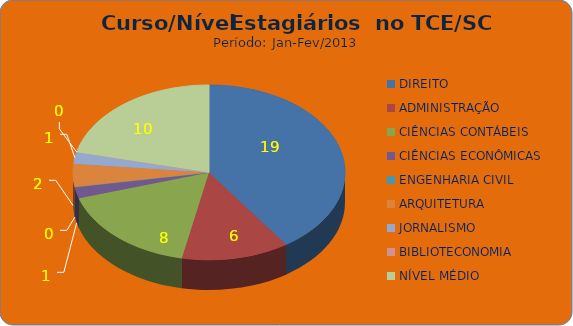
| Category | Series 0 |
|---|---|
| DIREITO | 19 |
| ADMINISTRAÇÃO | 6 |
| CIÊNCIAS CONTÁBEIS | 8 |
| CIÊNCIAS ECONÔMICAS | 1 |
| ENGENHARIA CIVIL | 0 |
| ARQUITETURA | 2 |
| JORNALISMO | 1 |
| BIBLIOTECONOMIA | 0 |
| NÍVEL MÉDIO | 10 |